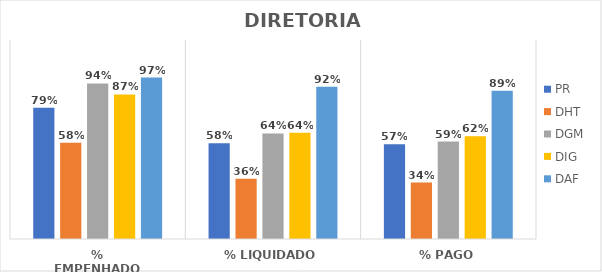
| Category | PR | DHT | DGM | DIG | DAF |
|---|---|---|---|---|---|
| % EMPENHADO | 0.791 | 0.58 | 0.938 | 0.871 | 0.974 |
| % LIQUIDADO | 0.577 | 0.363 | 0.637 | 0.64 | 0.918 |
| % PAGO | 0.571 | 0.34 | 0.588 | 0.619 | 0.893 |